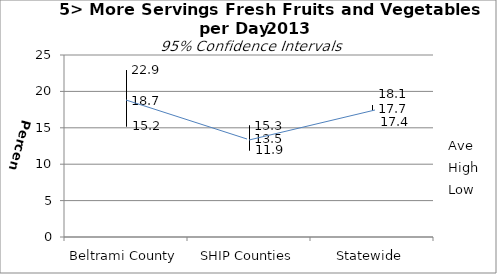
| Category | Ave | High | Low |
|---|---|---|---|
| Beltrami County | 18.7 | 22.9 | 15.2 |
| SHIP Counties | 13.5 | 15.3 | 11.9 |
| Statewide | 17.7 | 18.1 | 17.4 |